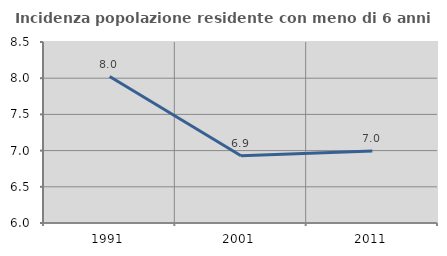
| Category | Incidenza popolazione residente con meno di 6 anni |
|---|---|
| 1991.0 | 8.023 |
| 2001.0 | 6.929 |
| 2011.0 | 6.994 |